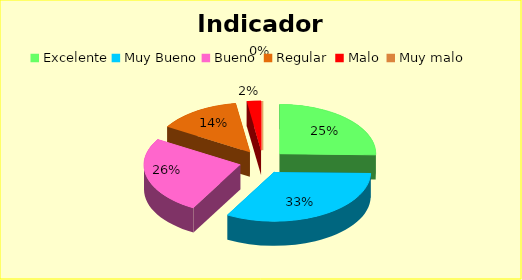
| Category | Series 0 |
|---|---|
| Excelente | 0.254 |
| Muy Bueno | 0.327 |
| Bueno  | 0.255 |
| Regular  | 0.14 |
| Malo  | 0.024 |
| Muy malo  | 0 |